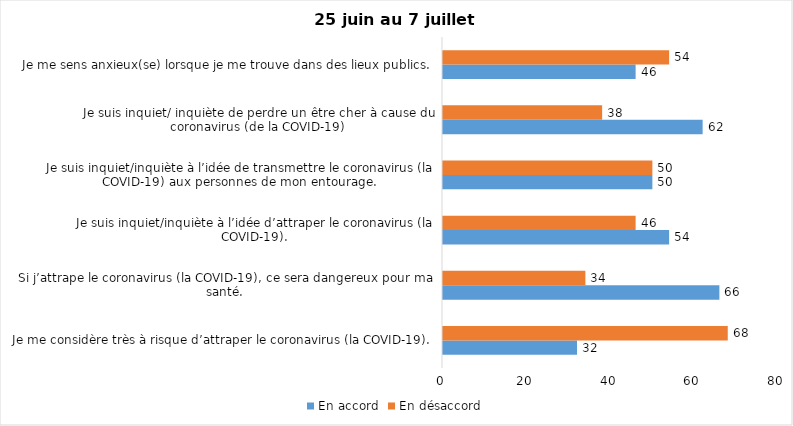
| Category | En accord | En désaccord |
|---|---|---|
| Je me considère très à risque d’attraper le coronavirus (la COVID-19). | 32 | 68 |
| Si j’attrape le coronavirus (la COVID-19), ce sera dangereux pour ma santé. | 66 | 34 |
| Je suis inquiet/inquiète à l’idée d’attraper le coronavirus (la COVID-19). | 54 | 46 |
| Je suis inquiet/inquiète à l’idée de transmettre le coronavirus (la COVID-19) aux personnes de mon entourage. | 50 | 50 |
| Je suis inquiet/ inquiète de perdre un être cher à cause du coronavirus (de la COVID-19) | 62 | 38 |
| Je me sens anxieux(se) lorsque je me trouve dans des lieux publics. | 46 | 54 |